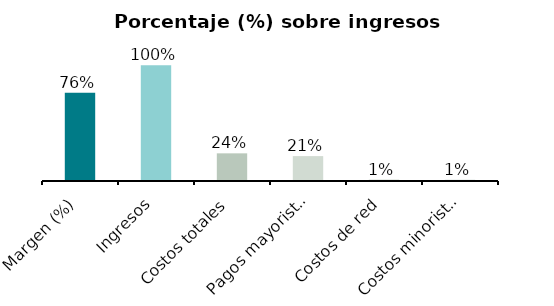
| Category | Series 0 |
|---|---|
| Margen (%) | 0.761 |
| Ingresos | 1 |
| Costos totales | 0.239 |
| Pagos mayoristas | 0.215 |
| Costos de red | 0.013 |
| Costos minoristas | 0.011 |